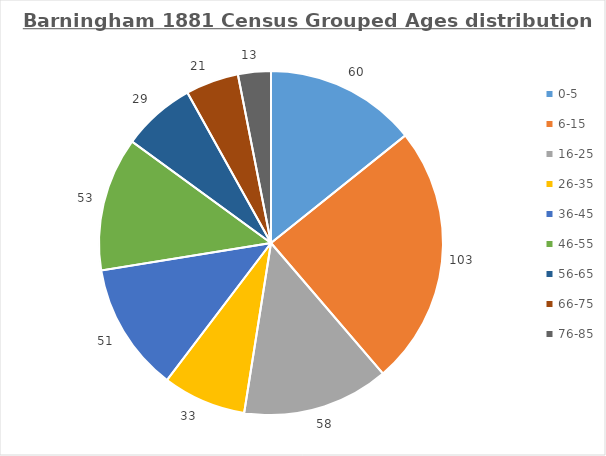
| Category | Grouped Ages distribution |
|---|---|
| 0-5  | 60 |
| 6-15 | 103 |
| 16-25  | 58 |
| 26-35  | 33 |
| 36-45  | 51 |
| 46-55  | 53 |
| 56-65  | 29 |
| 66-75  | 21 |
| 76-85  | 13 |